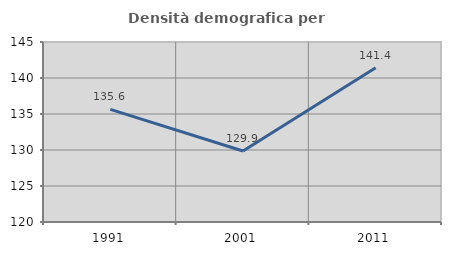
| Category | Densità demografica |
|---|---|
| 1991.0 | 135.645 |
| 2001.0 | 129.869 |
| 2011.0 | 141.422 |